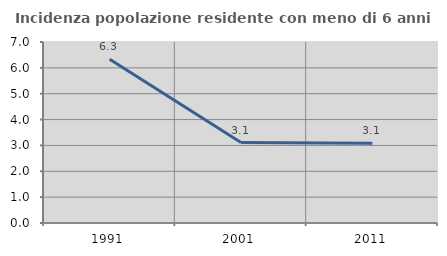
| Category | Incidenza popolazione residente con meno di 6 anni |
|---|---|
| 1991.0 | 6.33 |
| 2001.0 | 3.111 |
| 2011.0 | 3.087 |